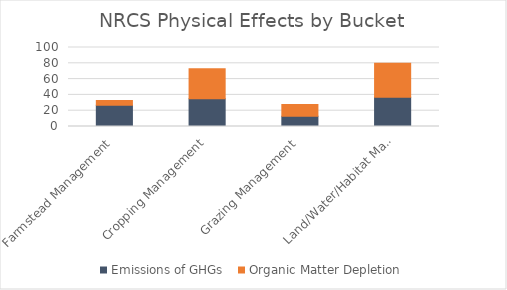
| Category | Emissions of GHGs  | Organic Matter Depletion |
|---|---|---|
| Farmstead Management | 27 | 6 |
| Cropping Management | 35 | 38 |
| Grazing Management | 13 | 15 |
| Land/Water/Habitat Management | 37 | 43 |